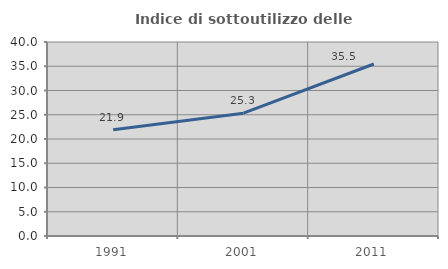
| Category | Indice di sottoutilizzo delle abitazioni  |
|---|---|
| 1991.0 | 21.908 |
| 2001.0 | 25.332 |
| 2011.0 | 35.469 |